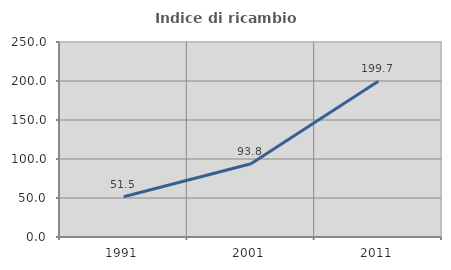
| Category | Indice di ricambio occupazionale  |
|---|---|
| 1991.0 | 51.536 |
| 2001.0 | 93.819 |
| 2011.0 | 199.699 |